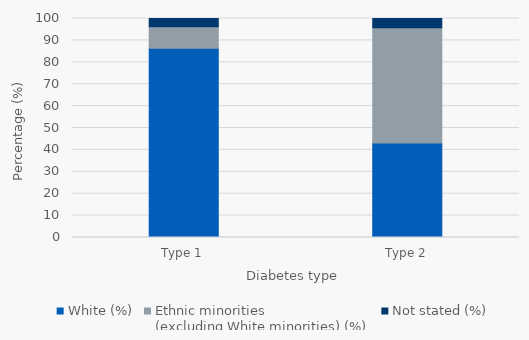
| Category | White (%) | Ethnic minorities 
(excluding White minorities) (%) | Not stated (%) |
|---|---|---|---|
| Type 1 | 86.374 | 9.91 | 3.716 |
| Type 2 | 43.098 | 52.632 | 4.369 |